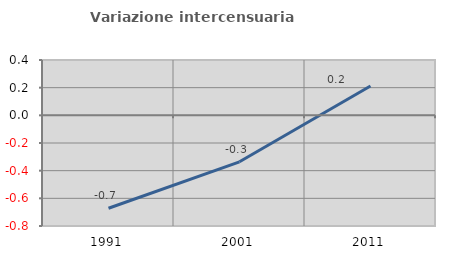
| Category | Variazione intercensuaria annua |
|---|---|
| 1991.0 | -0.672 |
| 2001.0 | -0.336 |
| 2011.0 | 0.212 |